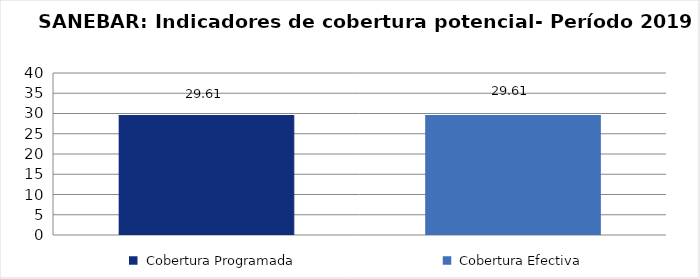
| Category | Total Programa |
|---|---|
| Cobertura Programada | 29.612 |
| Cobertura Efectiva | 29.612 |